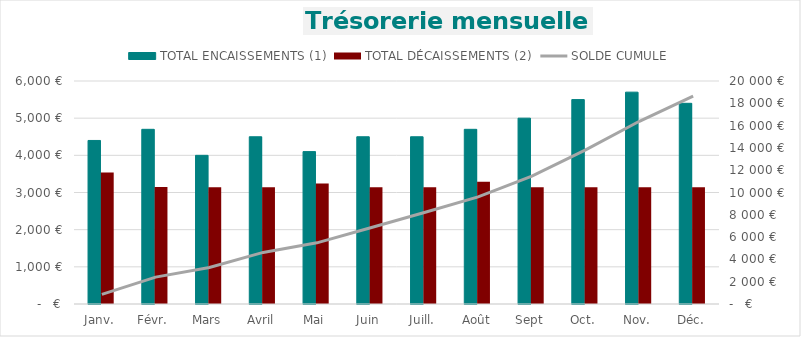
| Category | TOTAL ENCAISSEMENTS (1) | TOTAL DÉCAISSEMENTS (2) |
|---|---|---|
| Janv. | 4400 | 3541.36 |
| Févr. | 4700 | 3148.81 |
| Mars | 4000 | 3141.36 |
| Avril | 4500 | 3141.36 |
| Mai | 4100 | 3241.36 |
| Juin | 4500 | 3141.36 |
| Juill. | 4500 | 3141.36 |
| Août | 4700 | 3291.36 |
| Sept | 5000 | 3141.36 |
| Oct. | 5500 | 3141.36 |
| Nov. | 5700 | 3141.36 |
| Déc. | 5400 | 3141.36 |